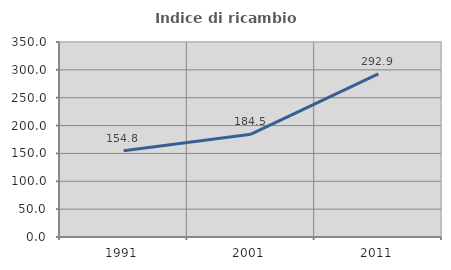
| Category | Indice di ricambio occupazionale  |
|---|---|
| 1991.0 | 154.795 |
| 2001.0 | 184.469 |
| 2011.0 | 292.945 |